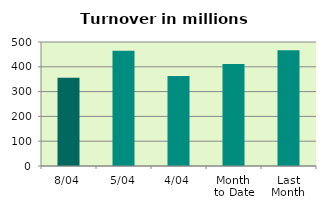
| Category | Series 0 |
|---|---|
| 8/04 | 355.418 |
| 5/04 | 464.569 |
| 4/04 | 362.633 |
| Month 
to Date | 411.171 |
| Last
Month | 466.511 |